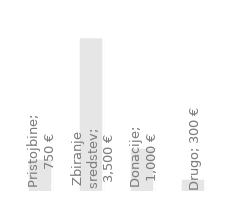
| Category | Letni prihodek |
|---|---|
| Pristojbine | 750 |
| Zbiranje sredstev | 3500 |
| Donacije | 1000 |
| Drugo | 300 |